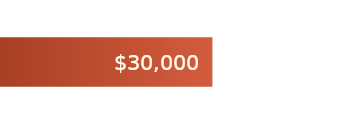
| Category | Total Liabilities | Padding |
|---|---|---|
| 0 | 30000 | 18600 |